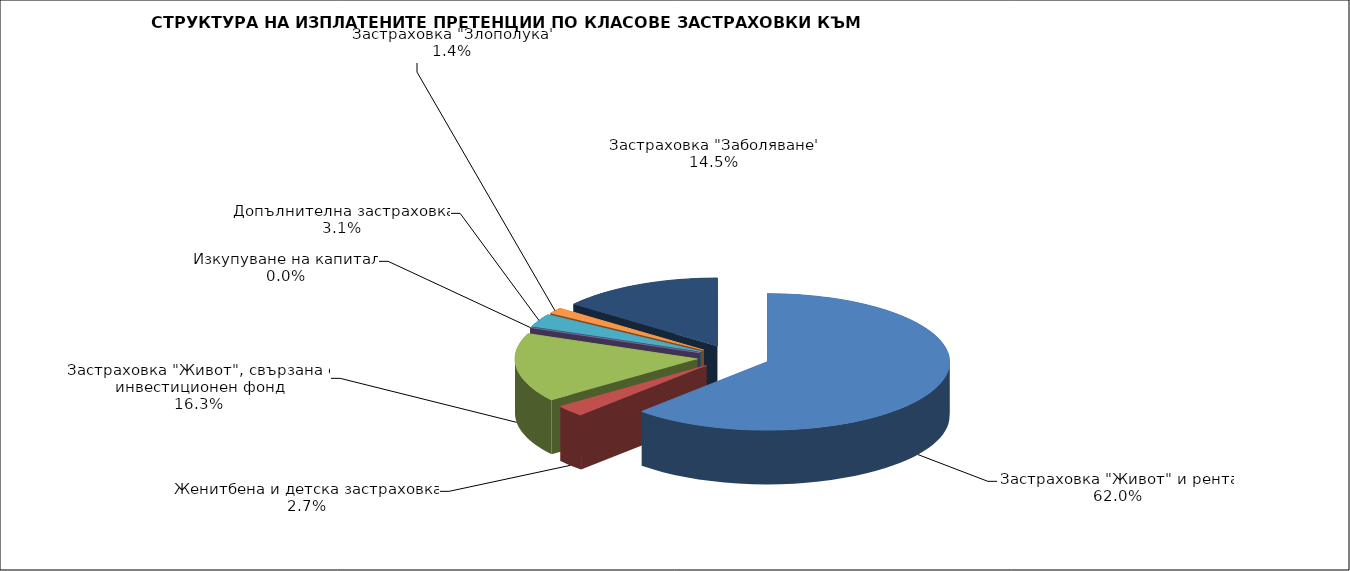
| Category | 106,442,902 |
|---|---|
| Застраховка "Живот" и рента | 106442901.984 |
| Женитбена и детска застраховка | 4626690.995 |
| Застраховка "Живот", свързана с инвестиционен фонд | 27948860.911 |
| Изкупуване на капитал | 0 |
| Допълнителна застраховка | 5277693.151 |
| Застраховка "Злополука" | 2427708.393 |
| Застраховка "Заболяване" | 24832748.369 |